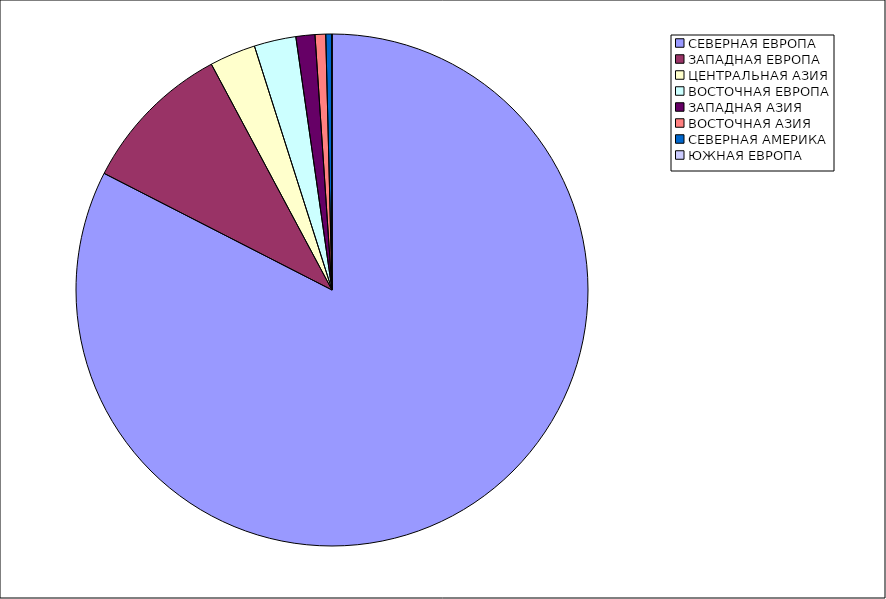
| Category | Оборот |
|---|---|
| СЕВЕРНАЯ ЕВРОПА | 82.52 |
| ЗАПАДНАЯ ЕВРОПА | 9.66 |
| ЦЕНТРАЛЬНАЯ АЗИЯ | 2.91 |
| ВОСТОЧНАЯ ЕВРОПА | 2.64 |
| ЗАПАДНАЯ АЗИЯ | 1.2 |
| ВОСТОЧНАЯ АЗИЯ | 0.67 |
| СЕВЕРНАЯ АМЕРИКА | 0.39 |
| ЮЖНАЯ ЕВРОПА | 0 |